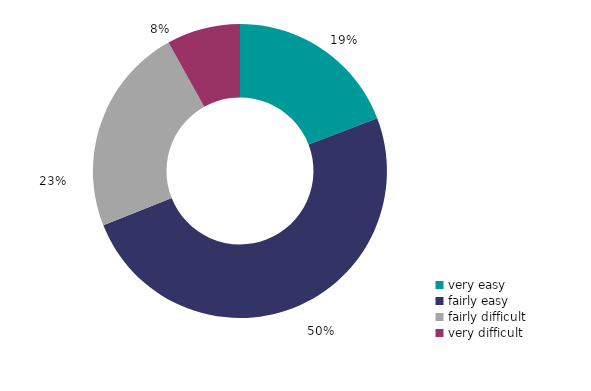
| Category | Series 0 |
|---|---|
| very easy | 518.307 |
| fairly easy | 1348.604 |
| fairly difficult | 620.158 |
| very difficult | 218.795 |